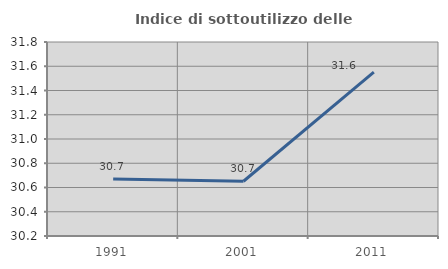
| Category | Indice di sottoutilizzo delle abitazioni  |
|---|---|
| 1991.0 | 30.67 |
| 2001.0 | 30.651 |
| 2011.0 | 31.551 |